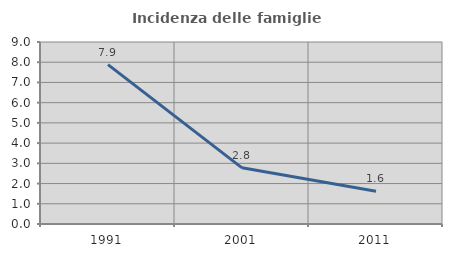
| Category | Incidenza delle famiglie numerose |
|---|---|
| 1991.0 | 7.883 |
| 2001.0 | 2.778 |
| 2011.0 | 1.616 |